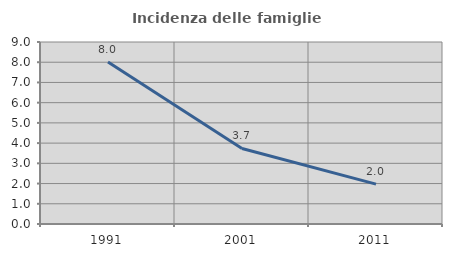
| Category | Incidenza delle famiglie numerose |
|---|---|
| 1991.0 | 8.013 |
| 2001.0 | 3.735 |
| 2011.0 | 1.973 |